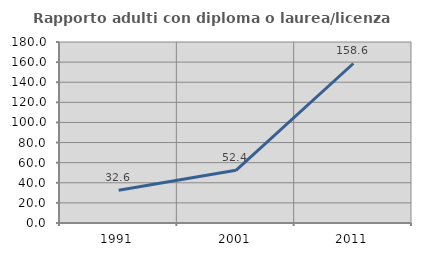
| Category | Rapporto adulti con diploma o laurea/licenza media  |
|---|---|
| 1991.0 | 32.609 |
| 2001.0 | 52.381 |
| 2011.0 | 158.621 |